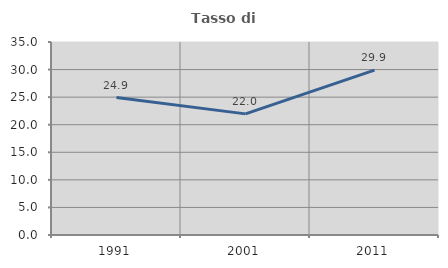
| Category | Tasso di occupazione   |
|---|---|
| 1991.0 | 24.919 |
| 2001.0 | 21.966 |
| 2011.0 | 29.896 |